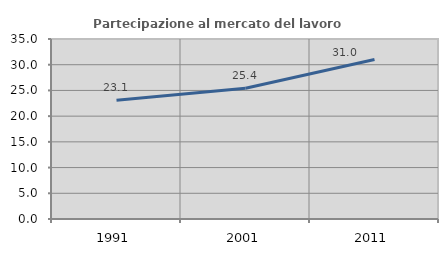
| Category | Partecipazione al mercato del lavoro  femminile |
|---|---|
| 1991.0 | 23.106 |
| 2001.0 | 25.417 |
| 2011.0 | 31.02 |